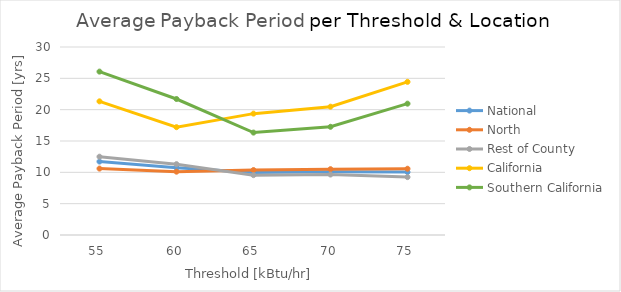
| Category | National | North | Rest of County | California | Southern California |
|---|---|---|---|---|---|
| 55.0 | 11.723 | 10.598 | 12.493 | 21.328 | 26.072 |
| 60.0 | 10.717 | 10.105 | 11.306 | 17.204 | 21.702 |
| 65.0 | 9.985 | 10.364 | 9.551 | 19.367 | 16.344 |
| 70.0 | 10.107 | 10.503 | 9.651 | 20.476 | 17.267 |
| 75.0 | 10.036 | 10.574 | 9.239 | 24.438 | 20.959 |